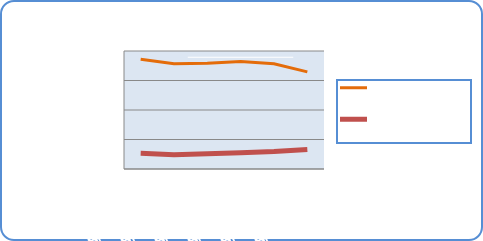
| Category | Motorin Türleri  | Benzin Türleri |
|---|---|---|
| 8/13/18 | 74461993.684 | 10675640.924 |
| 8/14/18 | 71402125.508 | 9745445.93 |
| 8/15/18 | 71707106.273 | 10371009.942 |
| 8/16/18 | 72839444.724 | 11067642.96 |
| 8/17/18 | 71386397.322 | 11886829.603 |
| 8/18/18 | 65821948.978 | 13252940.818 |